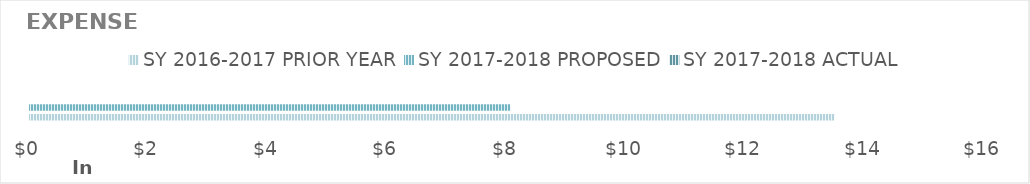
| Category | SY 2016-2017 | SY 2017-2018 |
|---|---|---|
| 0 | 13479.55 | 0 |